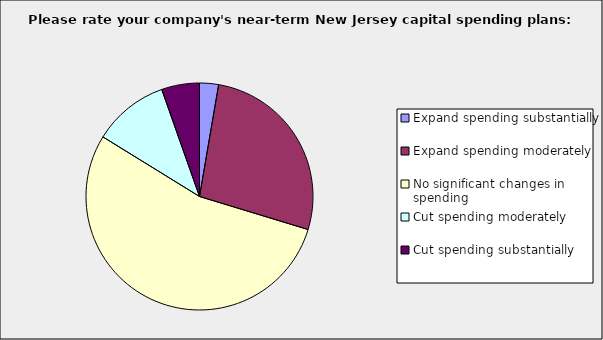
| Category | Series 0 |
|---|---|
| Expand spending substantially | 0.027 |
| Expand spending moderately | 0.27 |
| No significant changes in spending | 0.541 |
| Cut spending moderately | 0.108 |
| Cut spending substantially | 0.054 |